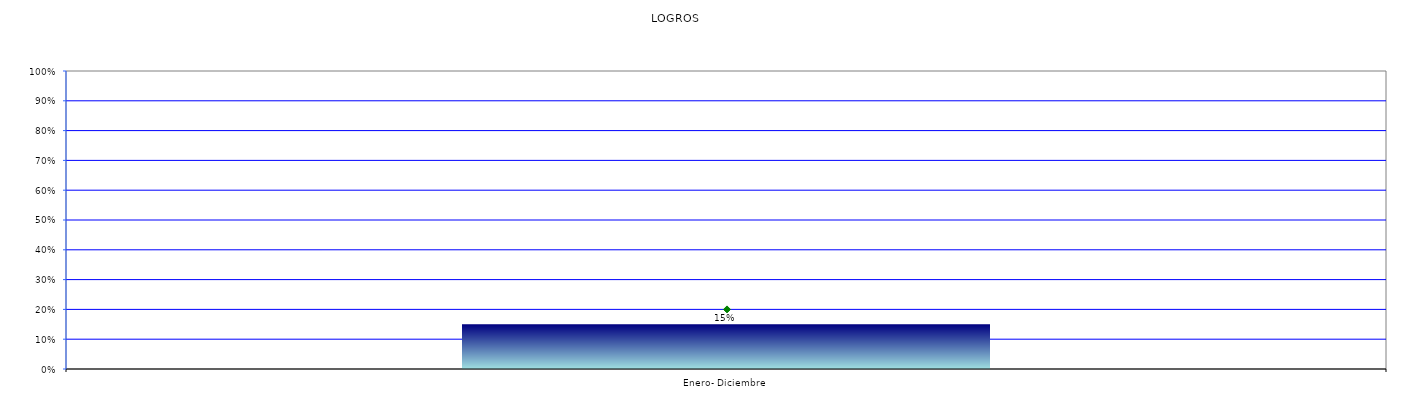
| Category | LOGROS |
|---|---|
| Enero- Diciembre | 0.15 |